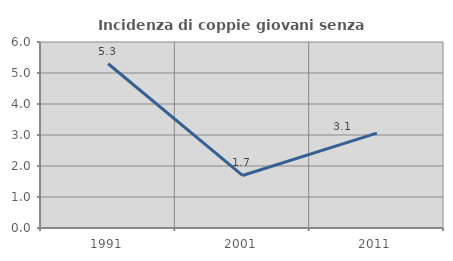
| Category | Incidenza di coppie giovani senza figli |
|---|---|
| 1991.0 | 5.298 |
| 2001.0 | 1.695 |
| 2011.0 | 3.061 |